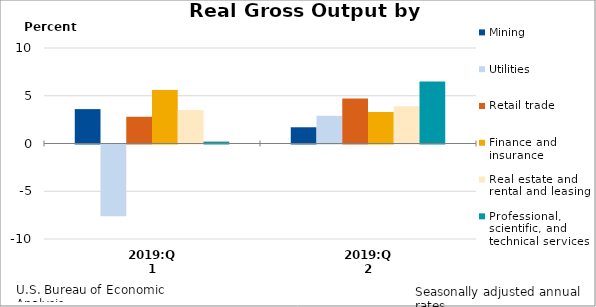
| Category | Mining | Utilities | Retail trade | Finance and insurance | Real estate and rental and leasing | Professional, scientific, and technical services |
|---|---|---|---|---|---|---|
| 2019:Q1 | 3.6 | -7.5 | 2.8 | 5.6 | 3.5 | 0.2 |
| 2019:Q2 | 1.7 | 2.9 | 4.7 | 3.3 | 3.9 | 6.5 |